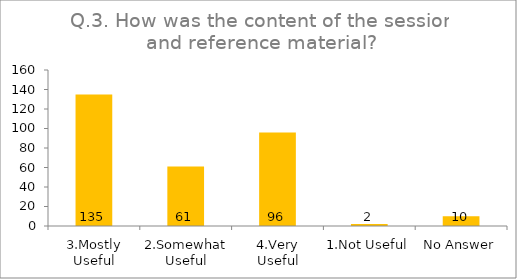
| Category | Q.3. How was the content of the session and reference material? |
|---|---|
| 3.Mostly Useful | 135 |
| 2.Somewhat Useful | 61 |
| 4.Very Useful | 96 |
| 1.Not Useful | 2 |
| No Answer | 10 |